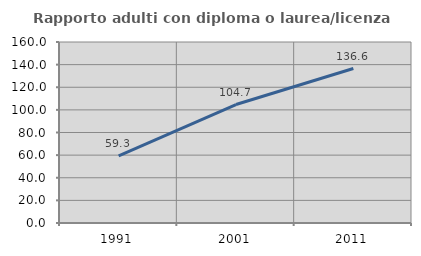
| Category | Rapporto adulti con diploma o laurea/licenza media  |
|---|---|
| 1991.0 | 59.257 |
| 2001.0 | 104.732 |
| 2011.0 | 136.57 |